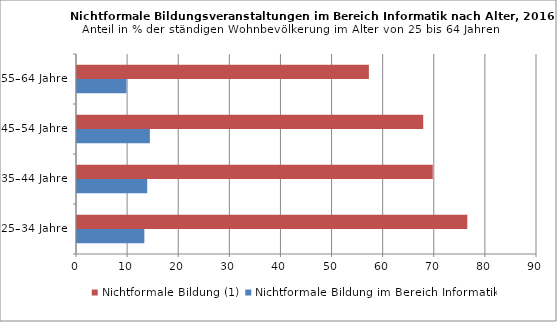
| Category | Nichtformale Bildung im Bereich Informatik | Nichtformale Bildung (1) |
|---|---|---|
| 25–34 Jahre | 13.176 | 76.366 |
| 35–44 Jahre | 13.74 | 69.606 |
| 45–54 Jahre | 14.26 | 67.737 |
| 55–64 Jahre | 9.679 | 57.106 |